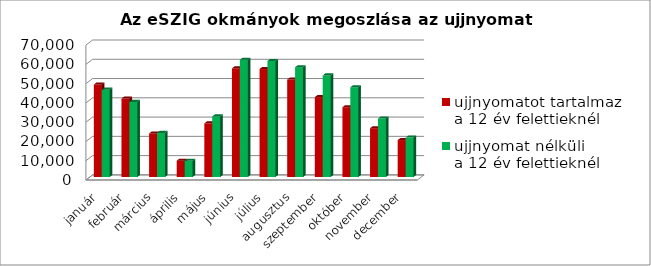
| Category | ujjnyomatot tartalmaz 
a 12 év felettieknél | ujjnyomat nélküli 
a 12 év felettieknél |
|---|---|---|
| január | 47998 | 45351 |
| február | 40736 | 38983 |
| március | 22619 | 22897 |
| április | 8476 | 8418 |
| május | 27875 | 31449 |
| június | 56393 | 60842 |
| július | 56047 | 60206 |
| augusztus | 50569 | 57002 |
| szeptember | 41480 | 52740 |
| október | 36225 | 46593 |
| november | 25337 | 30342 |
| december | 19183 | 20454 |